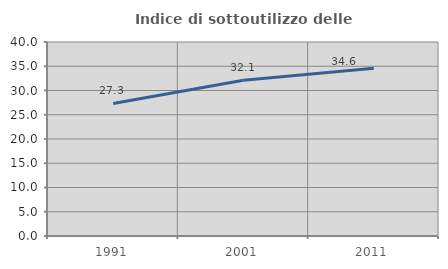
| Category | Indice di sottoutilizzo delle abitazioni  |
|---|---|
| 1991.0 | 27.326 |
| 2001.0 | 32.099 |
| 2011.0 | 34.568 |